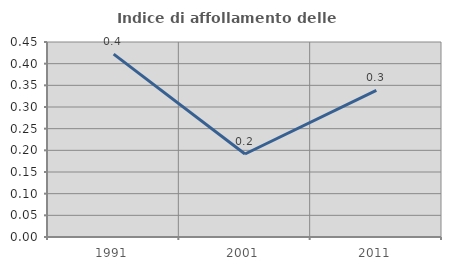
| Category | Indice di affollamento delle abitazioni  |
|---|---|
| 1991.0 | 0.422 |
| 2001.0 | 0.192 |
| 2011.0 | 0.338 |